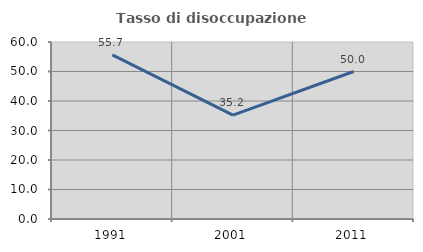
| Category | Tasso di disoccupazione giovanile  |
|---|---|
| 1991.0 | 55.652 |
| 2001.0 | 35.211 |
| 2011.0 | 50 |